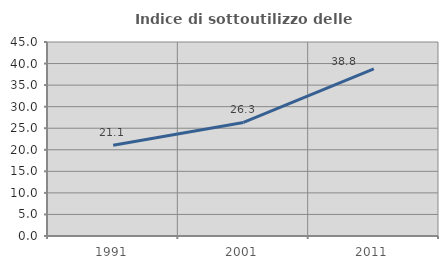
| Category | Indice di sottoutilizzo delle abitazioni  |
|---|---|
| 1991.0 | 21.054 |
| 2001.0 | 26.345 |
| 2011.0 | 38.788 |